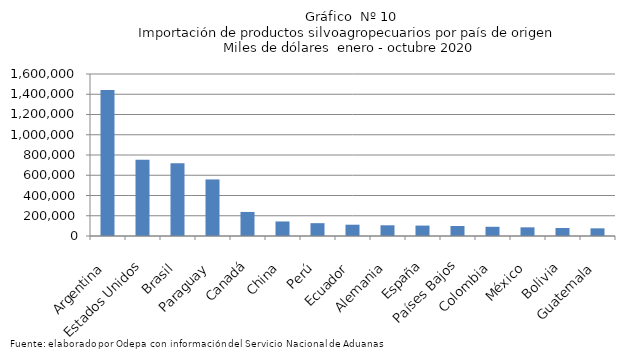
| Category | Series 0 |
|---|---|
| Argentina | 1441637.609 |
| Estados Unidos | 753337.721 |
| Brasil | 719563.429 |
| Paraguay | 558706.627 |
| Canadá | 237651.058 |
| China | 143651.241 |
| Perú | 126675.335 |
| Ecuador | 111524.12 |
| Alemania | 105708.848 |
| España | 102892.379 |
| Países Bajos | 98916.655 |
| Colombia | 91064.636 |
| México | 85549.058 |
| Bolivia | 79098.828 |
| Guatemala | 75758.524 |